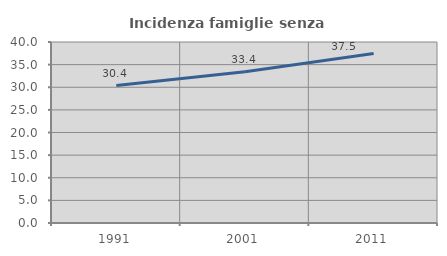
| Category | Incidenza famiglie senza nuclei |
|---|---|
| 1991.0 | 30.387 |
| 2001.0 | 33.445 |
| 2011.0 | 37.459 |